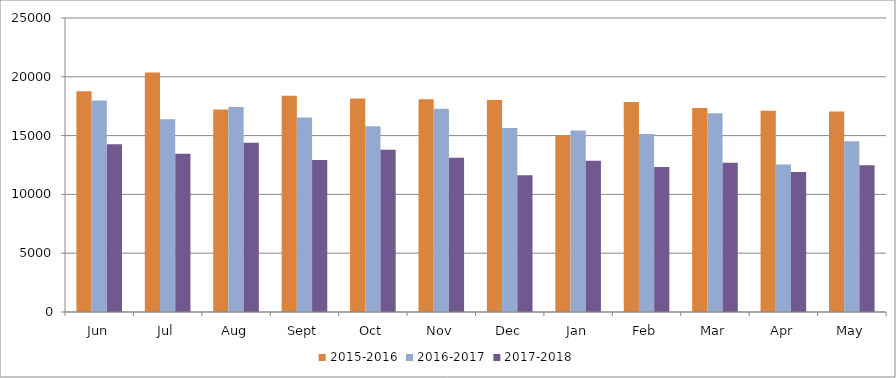
| Category | 2015-2016 | 2016-2017 | 2017-2018 |
|---|---|---|---|
| Jun | 18770 | 17982 | 14273 |
| Jul | 20367 | 16399 | 13459 |
| Aug | 17217 | 17441 | 14398 |
| Sept | 18397 | 16545 | 12920 |
| Oct | 18162 | 15788 | 13796 |
| Nov | 18093 | 17288 | 13122 |
| Dec | 18031 | 15636 | 11623 |
| Jan | 15017 | 15429 | 12863 |
| Feb | 17856 | 15146 | 12337 |
| Mar | 17356 | 16901 | 12683 |
| Apr | 17108 | 12534 | 11912 |
| May | 17044 | 14513 | 12477 |